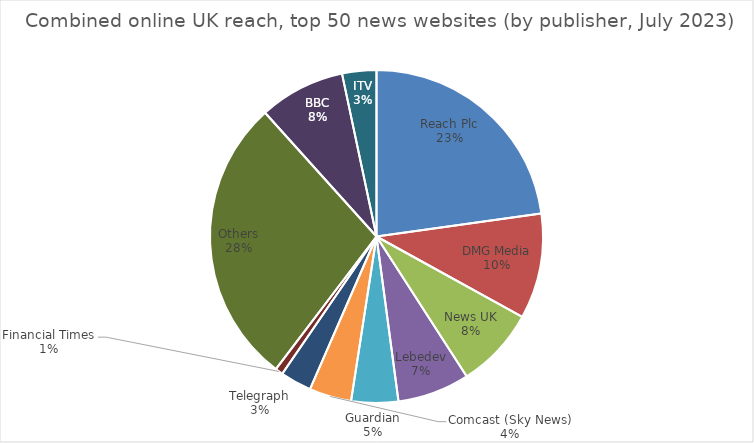
| Category | Series 0 |
|---|---|
| Reach Plc | 103.5 |
| DMG Media | 46.5 |
| News UK | 35.7 |
| Lebedev | 31.8 |
| Guardian | 20.7 |
| Comcast (Sky News) | 18.6 |
| Telegraph | 13.8 |
| Financial Times | 3.4 |
| Others | 127.2 |
| BBC | 37.9 |
| ITV | 15.1 |